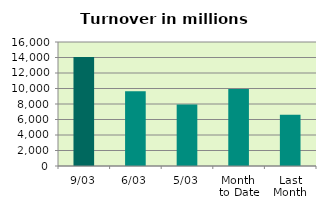
| Category | Series 0 |
|---|---|
| 9/03 | 14072.153 |
| 6/03 | 9659.114 |
| 5/03 | 7942.959 |
| Month 
to Date | 9948.581 |
| Last
Month | 6605.047 |